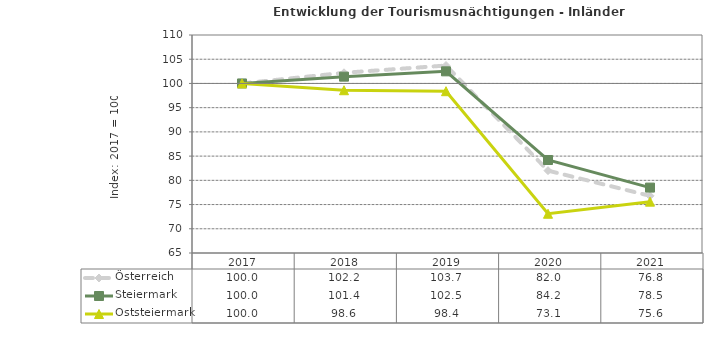
| Category | Österreich | Steiermark | Oststeiermark |
|---|---|---|---|
| 2021.0 | 76.8 | 78.5 | 75.6 |
| 2020.0 | 82 | 84.2 | 73.1 |
| 2019.0 | 103.7 | 102.5 | 98.4 |
| 2018.0 | 102.2 | 101.4 | 98.6 |
| 2017.0 | 100 | 100 | 100 |